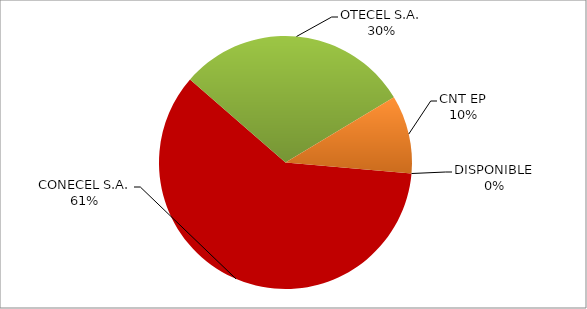
| Category | CÓDIGO DE RED 99 |
|---|---|
| CONECEL S.A. | 0.6 |
| OTECEL S.A. | 0.3 |
| CNT EP | 0.1 |
| DISPONIBLE | 0 |